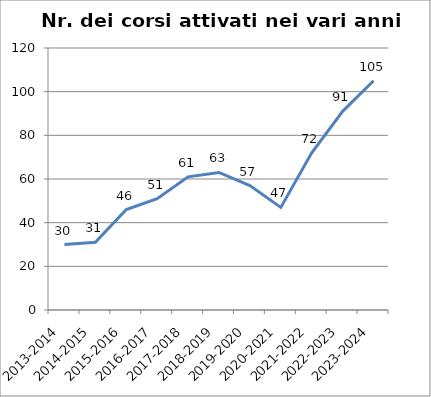
| Category | Nr. Corsi Attivati |
|---|---|
| 2013-2014 | 30 |
| 2014-2015 | 31 |
| 2015-2016 | 46 |
| 2016-2017 | 51 |
| 2017-2018 | 61 |
| 2018-2019 | 63 |
| 2019-2020 | 57 |
| 2020-2021 | 47 |
| 2021-2022 | 72 |
| 2022-2023 | 91 |
| 2023-2024 | 105 |